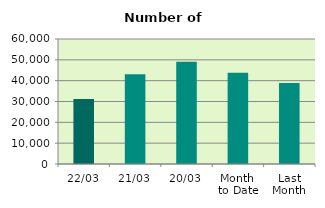
| Category | Series 0 |
|---|---|
| 22/03 | 31168 |
| 21/03 | 43038 |
| 20/03 | 49074 |
| Month 
to Date | 43850.875 |
| Last
Month | 38877.2 |